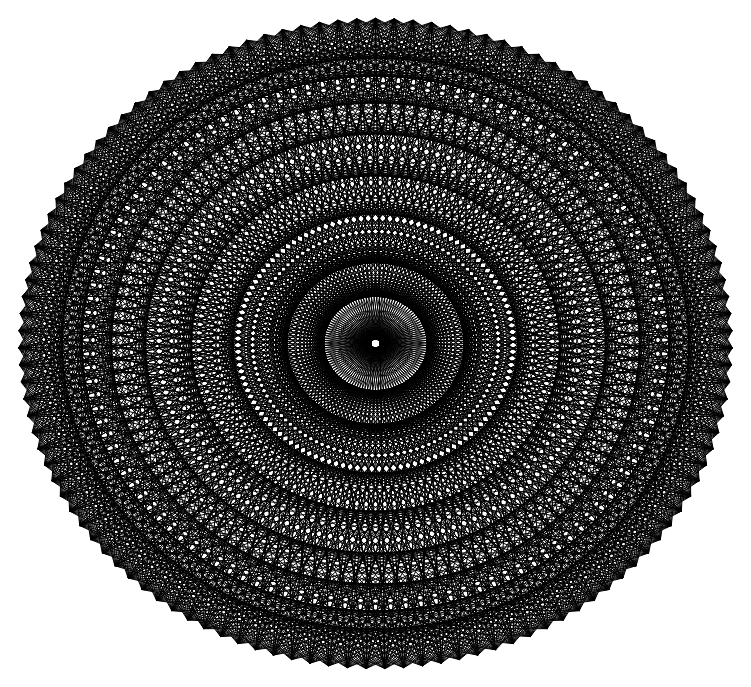
| Category | Series 0 |
|---|---|
| 0.0 | 1 |
| 0.026396871769836513 | -1 |
| -0.3115266979333915 | 0.95 |
| 0.7300520325410703 | -0.683 |
| -0.9978228006780053 | -0.066 |
| 0.40994978912605357 | 0.912 |
| 0.8287093708368187 | -0.56 |
| -0.4808280279743593 | -0.877 |
| -0.9894770367246195 | 0.145 |
| -0.40994978912605373 | 0.912 |
| 0.43388373911755823 | -0.901 |
| -0.6736956436465571 | 0.739 |
| 0.9460425935861947 | -0.324 |
| -0.8830852662071508 | -0.469 |
| 0.0 | 1 |
| 0.9853128822394974 | -0.171 |
| -0.07911704249342456 | -0.997 |
| -0.961825643172819 | -0.274 |
| -0.7478370394583645 | 0.664 |
| 0.7651008665813082 | -0.644 |
| -0.9174397974871565 | 0.398 |
| 0.9957341762950345 | 0.092 |
| -0.6131156327275369 | -0.79 |
| -0.40994978912605373 | 0.912 |
| 0.9687143340637886 | 0.248 |
| 0.33650143872273913 | -0.942 |
| -0.765100866581308 | -0.644 |
| -0.954266640349623 | 0.299 |
| 0.9618256431728192 | -0.274 |
| -0.9999128816724107 | -0.013 |
| 0.8703918045762196 | 0.492 |
| -0.23537019294084238 | -0.972 |
| -0.7478370394583645 | 0.664 |
| 0.7818314824680298 | 0.623 |
| 0.6929684125462466 | -0.721 |
| -0.4338837391175584 | -0.901 |
| -0.9929516085716733 | -0.119 |
| 0.9894770367246195 | 0.145 |
| -0.9066174626478123 | -0.422 |
| 0.5920486389876383 | 0.806 |
| 0.18374951781657037 | -0.983 |
| -0.954266640349623 | 0.299 |
| 0.45751530847532307 | 0.889 |
| 0.9276227536119478 | -0.374 |
| -0.026396871769835826 | -1 |
| -0.8570917527421047 | -0.515 |
| 0.8431943797272186 | 0.538 |
| -0.6539533652969677 | -0.757 |
| 0.20963290366854653 | 0.978 |
| 0.570569036923155 | -0.821 |
| -0.9929516085716733 | -0.119 |
| 0.05277534713046237 | 0.999 |
| 0.9992160261242876 | 0.04 |
| 0.38573013845977966 | -0.923 |
| -0.5705690369231552 | -0.821 |
| 0.5486917960180737 | 0.836 |
| -0.28633484912211227 | -0.958 |
| -0.2096329036685463 | 0.978 |
| 0.8570917527421046 | -0.515 |
| -0.8570917527421047 | -0.515 |
| -0.36124166618715303 | 0.932 |
| 0.8951632913550623 | 0.446 |
| 0.7300520325410703 | -0.683 |
| -0.18374951781657056 | -0.983 |
| 0.15773807393743752 | 0.987 |
| 0.13161669982939386 | -0.991 |
| -0.5920486389876387 | 0.806 |
| 0.9929516085716734 | -0.119 |
| -0.5705690369231552 | -0.821 |
| -0.711758240489971 | 0.702 |
| 0.6337553362123162 | 0.774 |
| 0.9460425935861947 | -0.324 |
| 0.23537019294084263 | -0.972 |
| -0.26094344889801746 | 0.965 |
| 0.5264321628773561 | -0.85 |
| -0.8703918045762195 | 0.492 |
| 0.954266640349623 | 0.299 |
| -0.18374951781657056 | -0.983 |
| -0.9371592343544655 | 0.349 |
| 0.26094344889801674 | 0.965 |
| 0.9957341762950345 | 0.092 |
| 0.6131156327275371 | -0.79 |
| -0.6337553362123161 | 0.774 |
| 0.8287093708368187 | -0.56 |
| -0.9957341762950346 | 0.092 |
| 0.7478370394583644 | 0.664 |
| 0.23537019294084263 | -0.972 |
| -0.9978228006780053 | -0.066 |
| -0.1577380739374372 | 0.987 |
| 0.8703918045762196 | 0.492 |
| 0.8830852662071507 | -0.469 |
| -0.8951632913550626 | 0.446 |
| 0.9853128822394974 | -0.171 |
| -0.9460425935861949 | -0.324 |
| 0.40994978912605357 | 0.912 |
| 0.6131156327275371 | -0.79 |
| -0.8830852662071508 | -0.469 |
| -0.5486917960180743 | 0.836 |
| 0.5920486389876383 | 0.806 |
| 0.9978228006780053 | -0.066 |
| -0.9992160261242876 | 0.04 |
| 0.9687143340637886 | 0.248 |
| -0.7300520325410699 | -0.683 |
| 0.0 | 1 |
| 0.8830852662071507 | -0.469 |
| -0.6131156327275369 | -0.79 |
| -0.8431943797272183 | 0.538 |
| 0.20963290366854653 | 0.978 |
| 0.9371592343544655 | 0.349 |
| -0.9276227536119476 | -0.374 |
| 0.7818314824680298 | 0.623 |
| -0.3857301384597794 | -0.923 |
| -0.40994978912605373 | 0.912 |
| 0.9978228006780053 | -0.066 |
| -0.23537019294084238 | -0.972 |
| -0.9894770367246195 | 0.145 |
| -0.2096329036685463 | 0.978 |
| 0.7117582404899709 | 0.702 |
| -0.6929684125462469 | -0.721 |
| 0.45751530847532307 | 0.889 |
| 0.026396871769836513 | -1 |
| -0.7478370394583645 | 0.664 |
| 0.9371592343544655 | 0.349 |
| 0.18374951781657037 | -0.983 |
| -0.961825643172819 | -0.274 |
| -0.5920486389876387 | 0.806 |
| 0.3612416661871529 | 0.932 |
| -0.33650143872273935 | -0.942 |
| 0.05277534713046237 | 0.999 |
| 0.43388373911755823 | -0.901 |
| -0.954266640349623 | 0.299 |
| 0.7117582404899709 | 0.702 |
| 0.570569036923155 | -0.821 |
| -0.765100866581308 | -0.644 |
| -0.8703918045762195 | 0.492 |
| -0.05277534713046272 | 0.999 |
| 0.07911704249342437 | -0.997 |
| -0.36124166618715303 | 0.932 |
| 0.7651008665813082 | -0.644 |
| -0.9929516085716733 | -0.119 |
| 0.3612416661871529 | 0.932 |
| 0.8570917527421046 | -0.515 |
| -0.4338837391175584 | -0.901 |
| -0.9957341762950346 | 0.092 |
| -0.45751530847532335 | 0.889 |
| 0.48082802797435914 | -0.877 |
| -0.711758240489971 | 0.702 |
| 0.9618256431728192 | -0.274 |
| -0.8570917527421047 | -0.515 |
| -0.05277534713046272 | 0.999 |
| 0.9929516085716734 | -0.119 |
| -0.026396871769835826 | -1 |
| -0.9460425935861949 | -0.324 |
| -0.7818314824680299 | 0.623 |
| 0.7980172272802396 | -0.603 |
| -0.9371592343544655 | 0.349 |
| 0.9894770367246195 | 0.145 |
| -0.5705690369231552 | -0.821 |
| -0.45751530847532335 | 0.889 |
| 0.954266640349623 | 0.299 |
| 0.38573013845977966 | -0.923 |
| -0.7300520325410699 | -0.683 |
| -0.9687143340637886 | 0.248 |
| 0.9749279121818236 | -0.223 |
| -0.9978228006780053 | -0.066 |
| 0.8431943797272186 | 0.538 |
| -0.18374951781657056 | -0.983 |
| -0.7818314824680299 | 0.623 |
| 0.7478370394583644 | 0.664 |
| 0.7300520325410703 | -0.683 |
| -0.3857301384597794 | -0.923 |
| -0.9853128822394974 | -0.171 |
| 0.9804620471832867 | 0.197 |
| -0.8830852662071508 | -0.469 |
| 0.5486917960180737 | 0.836 |
| 0.23537019294084263 | -0.972 |
| -0.9687143340637886 | 0.248 |
| 0.40994978912605357 | 0.912 |
| 0.9460425935861947 | -0.324 |
| 0.026396871769836513 | -1 |
| -0.8287093708368186 | -0.56 |
| 0.8136468209091602 | 0.581 |
| -0.6131156327275369 | -0.79 |
| 0.15773807393743752 | 0.987 |
| 0.6131156327275371 | -0.79 |
| -0.9853128822394974 | -0.171 |
| 0.0 | 1 |
| 0.9957341762950345 | 0.092 |
| 0.43388373911755823 | -0.901 |
| -0.5264321628773555 | -0.85 |
| 0.5038056506013295 | 0.864 |
| -0.23537019294084238 | -0.972 |
| -0.26094344889801746 | 0.965 |
| 0.8830852662071507 | -0.469 |
| -0.8287093708368186 | -0.56 |
| -0.40994978912605373 | 0.912 |
| 0.8703918045762196 | 0.492 |
| 0.7651008665813082 | -0.644 |
| -0.13161669982939317 | -0.991 |
| 0.10540359990284776 | 0.994 |
| 0.18374951781657037 | -0.983 |
| -0.6337553362123161 | 0.774 |
| 0.9978228006780053 | -0.066 |
| -0.5264321628773555 | -0.85 |
| -0.7478370394583645 | 0.664 |
| 0.5920486389876383 | 0.806 |
| 0.9618256431728192 | -0.274 |
| 0.2863348491221129 | -0.958 |
| -0.3115266979333915 | 0.95 |
| 0.570569036923155 | -0.821 |
| -0.8951632913550626 | 0.446 |
| 0.9371592343544655 | 0.349 |
| -0.13161669982939317 | -0.991 |
| -0.954266640349623 | 0.299 |
| 0.20963290366854653 | 0.978 |
| 0.9894770367246195 | 0.145 |
| 0.6539533652969682 | -0.757 |
| -0.6736956436465571 | 0.739 |
| 0.8570917527421046 | -0.515 |
| -0.9992160261242876 | 0.04 |
| 0.7117582404899709 | 0.702 |
| 0.2863348491221129 | -0.958 |
| -0.9929516085716733 | -0.119 |
| -0.2096329036685463 | 0.978 |
| 0.8431943797272186 | 0.538 |
| 0.9066174626478126 | -0.422 |
| -0.9174397974871565 | 0.398 |
| 0.9929516085716734 | -0.119 |
| -0.9276227536119476 | -0.374 |
| 0.3612416661871529 | 0.932 |
| 0.6539533652969682 | -0.757 |
| -0.8570917527421047 | -0.515 |
| -0.5920486389876387 | 0.806 |
| 0.5486917960180737 | 0.836 |
| 0.9999128816724107 | -0.013 |
| -0.9999128816724107 | -0.013 |
| 0.954266640349623 | 0.299 |
| -0.6929684125462469 | -0.721 |
| -0.05277534713046272 | 0.999 |
| 0.9066174626478126 | -0.422 |
| -0.5705690369231552 | -0.821 |
| -0.8703918045762195 | 0.492 |
| 0.15773807393743752 | 0.987 |
| 0.9174397974871562 | 0.398 |
| -0.9066174626478123 | -0.422 |
| 0.7478370394583644 | 0.664 |
| -0.33650143872273935 | -0.942 |
| -0.45751530847532335 | 0.889 |
| 0.9999128816724107 | -0.013 |
| -0.18374951781657056 | -0.983 |
| -0.9957341762950346 | 0.092 |
| -0.26094344889801746 | 0.965 |
| 0.6736956436465572 | 0.739 |
| -0.6539533652969677 | -0.757 |
| 0.40994978912605357 | 0.912 |
| 0.07911704249342437 | -0.997 |
| -0.7818314824680299 | 0.623 |
| 0.9174397974871562 | 0.398 |
| 0.23537019294084263 | -0.972 |
| -0.9460425935861949 | -0.324 |
| -0.6337553362123161 | 0.774 |
| 0.31152669793339155 | 0.95 |
| -0.28633484912211227 | -0.958 |
| 0.0 | 1 |
| 0.48082802797435914 | -0.877 |
| -0.9687143340637886 | 0.248 |
| 0.6736956436465572 | 0.739 |
| 0.6131156327275371 | -0.79 |
| -0.7300520325410699 | -0.683 |
| -0.8951632913550626 | 0.446 |
| -0.1054035999028482 | 0.994 |
| 0.13161669982939386 | -0.991 |
| -0.40994978912605373 | 0.912 |
| 0.7980172272802396 | -0.603 |
| -0.9853128822394974 | -0.171 |
| 0.31152669793339155 | 0.95 |
| 0.8830852662071507 | -0.469 |
| -0.3857301384597794 | -0.923 |
| -0.9992160261242876 | 0.04 |
| -0.5038056506013299 | 0.864 |
| 0.5264321628773561 | -0.85 |
| -0.7478370394583645 | 0.664 |
| 0.9749279121818236 | -0.223 |
| -0.8287093708368186 | -0.56 |
| -0.1054035999028482 | 0.994 |
| 0.9978228006780053 | -0.066 |
| 0.026396871769836513 | -1 |
| -0.9276227536119476 | -0.374 |
| -0.8136468209091604 | 0.581 |
| 0.8287093708368187 | -0.56 |
| -0.954266640349623 | 0.299 |
| 0.9804620471832867 | 0.197 |
| -0.5264321628773555 | -0.85 |
| -0.5038056506013299 | 0.864 |
| 0.9371592343544655 | 0.349 |
| 0.43388373911755823 | -0.901 |
| -0.6929684125462469 | -0.721 |
| -0.9804620471832867 | 0.197 |
| 0.9853128822394974 | -0.171 |
| -0.9929516085716733 | -0.119 |
| 0.8136468209091602 | 0.581 |
| -0.13161669982939317 | -0.991 |
| -0.8136468209091604 | 0.581 |
| 0.7117582404899709 | 0.702 |
| 0.7651008665813082 | -0.644 |
| -0.33650143872273935 | -0.942 |
| -0.9749279121818236 | -0.223 |
| 0.9687143340637886 | 0.248 |
| -0.8570917527421047 | -0.515 |
| 0.5038056506013295 | 0.864 |
| 0.2863348491221129 | -0.958 |
| -0.9804620471832867 | 0.197 |
| 0.3612416661871529 | 0.932 |
| 0.9618256431728192 | -0.274 |
| 0.07911704249342437 | -0.997 |
| -0.7980172272802395 | -0.603 |
| 0.7818314824680298 | 0.623 |
| -0.5705690369231552 | -0.821 |
| 0.10540359990284776 | 0.994 |
| 0.6539533652969682 | -0.757 |
| -0.9749279121818236 | -0.223 |
| -0.05277534713046272 | 0.999 |
| 0.9894770367246195 | 0.145 |
| 0.48082802797435914 | -0.877 |
| -0.4808280279743593 | -0.877 |
| 0.45751530847532307 | 0.889 |
| -0.18374951781657056 | -0.983 |
| -0.3115266979333915 | 0.95 |
| 0.9066174626478126 | -0.422 |
| -0.7980172272802395 | -0.603 |
| -0.45751530847532335 | 0.889 |
| 0.8431943797272186 | 0.538 |
| 0.7980172272802396 | -0.603 |
| -0.07911704249342456 | -0.997 |
| 0.05277534713046237 | 0.999 |
| 0.23537019294084263 | -0.972 |
| -0.6736956436465571 | 0.739 |
| 0.9999128816724107 | -0.013 |
| -0.4808280279743593 | -0.877 |
| -0.7818314824680299 | 0.623 |
| 0.5486917960180737 | 0.836 |
| 0.9749279121818236 | -0.223 |
| 0.33650143872273913 | -0.942 |
| -0.36124166618715303 | 0.932 |
| 0.6131156327275371 | -0.79 |
| -0.9174397974871565 | 0.398 |
| 0.9174397974871562 | 0.398 |
| -0.07911704249342456 | -0.997 |
| -0.9687143340637886 | 0.248 |
| 0.15773807393743752 | 0.987 |
| 0.9804620471832867 | 0.197 |
| 0.6929684125462466 | -0.721 |
| -0.711758240489971 | 0.702 |
| 0.8830852662071507 | -0.469 |
| -0.9999128816724107 | -0.013 |
| 0.6736956436465572 | 0.739 |
| 0.33650143872273913 | -0.942 |
| -0.9853128822394974 | -0.171 |
| -0.26094344889801746 | 0.965 |
| 0.8136468209091602 | 0.581 |
| 0.9276227536119478 | -0.374 |
| -0.9371592343544655 | 0.349 |
| 0.9978228006780053 | -0.066 |
| -0.9066174626478123 | -0.422 |
| 0.31152669793339155 | 0.95 |
| 0.6929684125462466 | -0.721 |
| -0.8287093708368186 | -0.56 |
| -0.6337553362123161 | 0.774 |
| 0.5038056506013295 | 0.864 |
| 0.9992160261242876 | 0.04 |
| -0.9978228006780053 | -0.066 |
| 0.9371592343544655 | 0.349 |
| -0.6539533652969677 | -0.757 |
| -0.1054035999028482 | 0.994 |
| 0.9276227536119478 | -0.374 |
| -0.5264321628773555 | -0.85 |
| -0.8951632913550626 | 0.446 |
| 0.10540359990284776 | 0.994 |
| 0.8951632913550623 | 0.446 |
| -0.8830852662071508 | -0.469 |
| 0.7117582404899709 | 0.702 |
| -0.28633484912211227 | -0.958 |
| -0.5038056506013299 | 0.864 |
| 0.9992160261242876 | 0.04 |
| -0.13161669982939317 | -0.991 |
| -0.9992160261242876 | 0.04 |
| -0.3115266979333915 | 0.95 |
| 0.6337553362123162 | 0.774 |
| -0.6131156327275369 | -0.79 |
| 0.3612416661871529 | 0.932 |
| 0.13161669982939386 | -0.991 |
| -0.8136468209091604 | 0.581 |
| 0.8951632913550623 | 0.446 |
| 0.2863348491221129 | -0.958 |
| -0.9276227536119476 | -0.374 |
| -0.6736956436465571 | 0.739 |
| 0.26094344889801674 | 0.965 |
| -0.23537019294084238 | -0.972 |
| -0.05277534713046272 | 0.999 |
| 0.5264321628773561 | -0.85 |
| -0.9804620471832867 | 0.197 |
| 0.6337553362123162 | 0.774 |
| 0.6539533652969682 | -0.757 |
| -0.6929684125462469 | -0.721 |
| -0.9174397974871565 | 0.398 |
| -0.1577380739374372 | 0.987 |
| 0.18374951781657037 | -0.983 |
| -0.45751530847532335 | 0.889 |
| 0.8287093708368187 | -0.56 |
| -0.9749279121818236 | -0.223 |
| 0.26094344889801674 | 0.965 |
| 0.9066174626478126 | -0.422 |
| -0.33650143872273935 | -0.942 |
| -0.9999128816724107 | -0.013 |
| -0.5486917960180743 | 0.836 |
| 0.570569036923155 | -0.821 |
| -0.7818314824680299 | 0.623 |
| 0.9853128822394974 | -0.171 |
| -0.7980172272802395 | -0.603 |
| -0.1577380739374372 | 0.987 |
| 0.9999128816724107 | -0.013 |
| 0.07911704249342437 | -0.997 |
| -0.9066174626478123 | -0.422 |
| -0.8431943797272183 | 0.538 |
| 0.8570917527421046 | -0.515 |
| -0.9687143340637886 | 0.248 |
| 0.9687143340637886 | 0.248 |
| -0.4808280279743593 | -0.877 |
| -0.5486917960180743 | 0.836 |
| 0.9174397974871562 | 0.398 |
| 0.48082802797435914 | -0.877 |
| -0.6539533652969677 | -0.757 |
| -0.9894770367246195 | 0.145 |
| 0.9929516085716734 | -0.119 |
| -0.9853128822394974 | -0.171 |
| 0.7818314824680298 | 0.623 |
| -0.07911704249342456 | -0.997 |
| -0.8431943797272183 | 0.538 |
| 0.6736956436465572 | 0.739 |
| 0.7980172272802396 | -0.603 |
| -0.28633484912211227 | -0.958 |
| -0.961825643172819 | -0.274 |
| 0.954266640349623 | 0.299 |
| -0.8287093708368186 | -0.56 |
| 0.45751530847532307 | 0.889 |
| 0.33650143872273913 | -0.942 |
| -0.9894770367246195 | 0.145 |
| 0.31152669793339155 | 0.95 |
| 0.9749279121818236 | -0.223 |
| 0.13161669982939386 | -0.991 |
| -0.765100866581308 | -0.644 |
| 0.7478370394583644 | 0.664 |
| -0.5264321628773555 | -0.85 |
| 0.05277534713046237 | 0.999 |
| 0.6929684125462466 | -0.721 |
| -0.961825643172819 | -0.274 |
| -0.1054035999028482 | 0.994 |
| 0.9804620471832867 | 0.197 |
| 0.5264321628773561 | -0.85 |
| -0.4338837391175584 | -0.901 |
| 0.40994978912605357 | 0.912 |
| -0.13161669982939317 | -0.991 |
| -0.36124166618715303 | 0.932 |
| 0.9276227536119478 | -0.374 |
| -0.765100866581308 | -0.644 |
| -0.5038056506013299 | 0.864 |
| 0.8136468209091602 | 0.581 |
| 0.8287093708368187 | -0.56 |
| -0.026396871769835826 | -1 |
| 0.0 | 1 |
| 0.2863348491221129 | -0.958 |
| -0.711758240489971 | 0.702 |
| 0.9992160261242876 | 0.04 |
| -0.4338837391175584 | -0.901 |
| -0.8136468209091604 | 0.581 |
| 0.5038056506013295 | 0.864 |
| 0.9853128822394974 | -0.171 |
| 0.38573013845977966 | -0.923 |
| -0.40994978912605373 | 0.912 |
| 0.6539533652969682 | -0.757 |
| -0.9371592343544655 | 0.349 |
| 0.8951632913550623 | 0.446 |
| -0.026396871769835826 | -1 |
| -0.9804620471832867 | 0.197 |
| 0.10540359990284776 | 0.994 |
| 0.9687143340637886 | 0.248 |
| 0.7300520325410703 | -0.683 |
| -0.7478370394583645 | 0.664 |
| 0.9066174626478126 | -0.422 |
| -0.9978228006780053 | -0.066 |
| 0.6337553362123162 | 0.774 |
| 0.38573013845977966 | -0.923 |
| -0.9749279121818236 | -0.223 |
| -0.3115266979333915 | 0.95 |
| 0.7818314824680298 | 0.623 |
| 0.9460425935861947 | -0.324 |
| -0.954266640349623 | 0.299 |
| 0.9999128816724107 | -0.013 |
| -0.8830852662071508 | -0.469 |
| 0.26094344889801674 | 0.965 |
| 0.7300520325410703 | -0.683 |
| -0.7980172272802395 | -0.603 |
| -0.6736956436465571 | 0.739 |
| 0.45751530847532307 | 0.889 |
| 0.9957341762950345 | 0.092 |
| -0.9929516085716733 | -0.119 |
| 0.9174397974871562 | 0.398 |
| -0.6131156327275369 | -0.79 |
| -0.1577380739374372 | 0.987 |
| 0.9460425935861947 | -0.324 |
| -0.4808280279743593 | -0.877 |
| -0.9174397974871565 | 0.398 |
| 0.05277534713046237 | 0.999 |
| 0.8703918045762196 | 0.492 |
| -0.8570917527421047 | -0.515 |
| 0.6736956436465572 | 0.739 |
| -0.23537019294084238 | -0.972 |
| -0.5486917960180743 | 0.836 |
| 0.9957341762950345 | 0.092 |
| -0.07911704249342456 | -0.997 |
| -0.9999128816724107 | -0.013 |
| -0.36124166618715303 | 0.932 |
| 0.5920486389876383 | 0.806 |
| -0.5705690369231552 | -0.821 |
| 0.31152669793339155 | 0.95 |
| 0.18374951781657037 | -0.983 |
| -0.8431943797272183 | 0.538 |
| 0.8703918045762196 | 0.492 |
| 0.33650143872273913 | -0.942 |
| -0.9066174626478123 | -0.422 |
| -0.711758240489971 | 0.702 |
| 0.20963290366854653 | 0.978 |
| -0.18374951781657056 | -0.983 |
| -0.1054035999028482 | 0.994 |
| 0.570569036923155 | -0.821 |
| -0.9894770367246195 | 0.145 |
| 0.5920486389876383 | 0.806 |
| 0.6929684125462466 | -0.721 |
| -0.6539533652969677 | -0.757 |
| -0.9371592343544655 | 0.349 |
| -0.2096329036685463 | 0.978 |
| 0.23537019294084263 | -0.972 |
| -0.5038056506013299 | 0.864 |
| 0.8570917527421046 | -0.515 |
| -0.961825643172819 | -0.274 |
| 0.20963290366854653 | 0.978 |
| 0.9276227536119478 | -0.374 |
| -0.28633484912211227 | -0.958 |
| -0.9978228006780053 | -0.066 |
| -0.5920486389876387 | 0.806 |
| 0.6131156327275371 | -0.79 |
| -0.8136468209091604 | 0.581 |
| 0.9929516085716734 | -0.119 |
| -0.765100866581308 | -0.644 |
| -0.2096329036685463 | 0.978 |
| 0.9992160261242876 | 0.04 |
| 0.13161669982939386 | -0.991 |
| -0.8830852662071508 | -0.469 |
| -0.8703918045762195 | 0.492 |
| 0.8830852662071507 | -0.469 |
| -0.9804620471832867 | 0.197 |
| 0.954266640349623 | 0.299 |
| -0.4338837391175584 | -0.901 |
| -0.5920486389876387 | 0.806 |
| 0.8951632913550623 | 0.446 |
| 0.5264321628773561 | -0.85 |
| -0.6131156327275369 | -0.79 |
| -0.9957341762950346 | 0.092 |
| 0.9978228006780053 | -0.066 |
| -0.9749279121818236 | -0.223 |
| 0.7478370394583644 | 0.664 |
| -0.026396871769835826 | -1 |
| -0.8703918045762195 | 0.492 |
| 0.6337553362123162 | 0.774 |
| 0.8287093708368187 | -0.56 |
| -0.23537019294084238 | -0.972 |
| -0.9460425935861949 | -0.324 |
| 0.9371592343544655 | 0.349 |
| -0.7980172272802395 | -0.603 |
| 0.40994978912605357 | 0.912 |
| 0.38573013845977966 | -0.923 |
| -0.9957341762950346 | 0.092 |
| 0.26094344889801674 | 0.965 |
| 0.9853128822394974 | -0.171 |
| 0.18374951781657037 | -0.983 |
| -0.7300520325410699 | -0.683 |
| 0.7117582404899709 | 0.702 |
| -0.4808280279743593 | -0.877 |
| 0.0 | 1 |
| 0.7300520325410703 | -0.683 |
| -0.9460425935861949 | -0.324 |
| -0.1577380739374372 | 0.987 |
| 0.9687143340637886 | 0.248 |
| 0.570569036923155 | -0.821 |
| -0.3857301384597794 | -0.923 |
| 0.3612416661871529 | 0.932 |
| -0.07911704249342456 | -0.997 |
| -0.40994978912605373 | 0.912 |
| 0.9460425935861947 | -0.324 |
| -0.7300520325410699 | -0.683 |
| -0.5486917960180743 | 0.836 |
| 0.7818314824680298 | 0.623 |
| 0.8570917527421046 | -0.515 |
| 0.026396871769836513 | -1 |
| -0.05277534713046272 | 0.999 |
| 0.33650143872273913 | -0.942 |
| -0.7478370394583645 | 0.664 |
| 0.9957341762950345 | 0.092 |
| -0.3857301384597794 | -0.923 |
| -0.8431943797272183 | 0.538 |
| 0.45751530847532307 | 0.889 |
| 0.9929516085716734 | -0.119 |
| 0.43388373911755823 | -0.901 |
| -0.45751530847532335 | 0.889 |
| 0.6929684125462466 | -0.721 |
| -0.954266640349623 | 0.299 |
| 0.8703918045762196 | 0.492 |
| 0.026396871769836513 | -1 |
| -0.9894770367246195 | 0.145 |
| 0.05277534713046237 | 0.999 |
| 0.954266640349623 | 0.299 |
| 0.7651008665813082 | -0.644 |
| -0.7818314824680299 | 0.623 |
| 0.9276227536119478 | -0.374 |
| -0.9929516085716733 | -0.119 |
| 0.5920486389876383 | 0.806 |
| 0.43388373911755823 | -0.901 |
| -0.961825643172819 | -0.274 |
| -0.36124166618715303 | 0.932 |
| 0.7478370394583644 | 0.664 |
| 0.9618256431728192 | -0.274 |
| -0.9687143340637886 | 0.248 |
| 0.9992160261242876 | 0.04 |
| -0.8570917527421047 | -0.515 |
| 0.20963290366854653 | 0.978 |
| 0.7651008665813082 | -0.644 |
| -0.765100866581308 | -0.644 |
| -0.711758240489971 | 0.702 |
| 0.40994978912605357 | 0.912 |
| 0.9894770367246195 | 0.145 |
| -0.9853128822394974 | -0.171 |
| 0.8951632913550623 | 0.446 |
| -0.5705690369231552 | -0.821 |
| -0.2096329036685463 | 0.978 |
| 0.9618256431728192 | -0.274 |
| -0.4338837391175584 | -0.901 |
| -0.9371592343544655 | 0.349 |
| 0.0 | 1 |
| 0.8431943797272186 | 0.538 |
| -0.8287093708368186 | -0.56 |
| 0.6337553362123162 | 0.774 |
| -0.18374951781657056 | -0.983 |
| -0.5920486389876387 | 0.806 |
| 0.9894770367246195 | 0.145 |
| -0.026396871769835826 | -1 |
| -0.9978228006780053 | -0.066 |
| -0.40994978912605373 | 0.912 |
| 0.5486917960180737 | 0.836 |
| -0.5264321628773555 | -0.85 |
| 0.26094344889801674 | 0.965 |
| 0.23537019294084263 | -0.972 |
| -0.8703918045762195 | 0.492 |
| 0.8431943797272186 | 0.538 |
| 0.38573013845977966 | -0.923 |
| -0.8830852662071508 | -0.469 |
| -0.7478370394583645 | 0.664 |
| 0.15773807393743752 | 0.987 |
| -0.13161669982939317 | -0.991 |
| -0.1577380739374372 | 0.987 |
| 0.6131156327275371 | -0.79 |
| -0.9957341762950346 | 0.092 |
| 0.5486917960180737 | 0.836 |
| 0.7300520325410703 | -0.683 |
| -0.6131156327275369 | -0.79 |
| -0.954266640349623 | 0.299 |
| -0.26094344889801746 | 0.965 |
| 0.2863348491221129 | -0.958 |
| -0.5486917960180743 | 0.836 |
| 0.8830852662071507 | -0.469 |
| -0.9460425935861949 | -0.324 |
| 0.15773807393743752 | 0.987 |
| 0.9460425935861947 | -0.324 |
| -0.23537019294084238 | -0.972 |
| -0.9929516085716733 | -0.119 |
| -0.6337553362123161 | 0.774 |
| 0.6539533652969682 | -0.757 |
| -0.8431943797272183 | 0.538 |
| 0.9978228006780053 | -0.066 |
| -0.7300520325410699 | -0.683 |
| -0.26094344889801746 | 0.965 |
| 0.9957341762950345 | 0.092 |
| 0.18374951781657037 | -0.983 |
| -0.8570917527421047 | -0.515 |
| -0.8951632913550626 | 0.446 |
| 0.9066174626478126 | -0.422 |
| -0.9894770367246195 | 0.145 |
| 0.9371592343544655 | 0.349 |
| -0.3857301384597794 | -0.923 |
| -0.6337553362123161 | 0.774 |
| 0.8703918045762196 | 0.492 |
| 0.570569036923155 | -0.821 |
| -0.5705690369231552 | -0.821 |
| -0.9992160261242876 | 0.04 |
| 0.9999128816724107 | -0.013 |
| -0.961825643172819 | -0.274 |
| 0.7117582404899709 | 0.702 |
| 0.026396871769836513 | -1 |
| -0.8951632913550626 | 0.446 |
| 0.5920486389876383 | 0.806 |
| 0.8570917527421046 | -0.515 |
| -0.18374951781657056 | -0.983 |
| -0.9276227536119476 | -0.374 |
| 0.9174397974871562 | 0.398 |
| -0.765100866581308 | -0.644 |
| 0.3612416661871529 | 0.932 |
| 0.43388373911755823 | -0.901 |
| -0.9992160261242876 | 0.04 |
| 0.20963290366854653 | 0.978 |
| 0.9929516085716734 | -0.119 |
| 0.23537019294084263 | -0.972 |
| -0.6929684125462469 | -0.721 |
| 0.6736956436465572 | 0.739 |
| -0.4338837391175584 | -0.901 |
| -0.05277534713046272 | 0.999 |
| 0.7651008665813082 | -0.644 |
| -0.9276227536119476 | -0.374 |
| -0.2096329036685463 | 0.978 |
| 0.954266640349623 | 0.299 |
| 0.6131156327275371 | -0.79 |
| -0.33650143872273935 | -0.942 |
| 0.31152669793339155 | 0.95 |
| -0.026396871769835826 | -1 |
| -0.45751530847532335 | 0.889 |
| 0.9618256431728192 | -0.274 |
| -0.6929684125462469 | -0.721 |
| -0.5920486389876387 | 0.806 |
| 0.7478370394583644 | 0.664 |
| 0.8830852662071507 | -0.469 |
| 0.07911704249342437 | -0.997 |
| -0.1054035999028482 | 0.994 |
| 0.38573013845977966 | -0.923 |
| -0.7818314824680299 | 0.623 |
| 0.9894770367246195 | 0.145 |
| -0.33650143872273935 | -0.942 |
| -0.8703918045762195 | 0.492 |
| 0.40994978912605357 | 0.912 |
| 0.9978228006780053 | -0.066 |
| 0.48082802797435914 | -0.877 |
| -0.5038056506013299 | 0.864 |
| 0.7300520325410703 | -0.683 |
| -0.9687143340637886 | 0.248 |
| 0.8431943797272186 | 0.538 |
| 0.07911704249342437 | -0.997 |
| -0.9957341762950346 | 0.092 |
| 0.0 | 1 |
| 0.9371592343544655 | 0.349 |
| 0.7980172272802396 | -0.603 |
| -0.8136468209091604 | 0.581 |
| 0.9460425935861947 | -0.324 |
| -0.9853128822394974 | -0.171 |
| 0.5486917960180737 | 0.836 |
| 0.48082802797435914 | -0.877 |
| -0.9460425935861949 | -0.324 |
| -0.40994978912605373 | 0.912 |
| 0.7117582404899709 | 0.702 |
| 0.9749279121818236 | -0.223 |
| -0.9804620471832867 | 0.197 |
| 0.9957341762950345 | 0.092 |
| -0.8287093708368186 | -0.56 |
| 0.15773807393743752 | 0.987 |
| 0.7980172272802396 | -0.603 |
| -0.7300520325410699 | -0.683 |
| -0.7478370394583645 | 0.664 |
| 0.3612416661871529 | 0.932 |
| 0.9804620471832867 | 0.197 |
| -0.9749279121818236 | -0.223 |
| 0.8703918045762196 | 0.492 |
| -0.5264321628773555 | -0.85 |
| -0.26094344889801746 | 0.965 |
| 0.9749279121818236 | -0.223 |
| -0.3857301384597794 | -0.923 |
| -0.954266640349623 | 0.299 |
| -0.05277534713046272 | 0.999 |
| 0.8136468209091602 | 0.581 |
| -0.7980172272802395 | -0.603 |
| 0.5920486389876383 | 0.806 |
| -0.13161669982939317 | -0.991 |
| -0.6337553362123161 | 0.774 |
| 0.9804620471832867 | 0.197 |
| 0.026396871769836513 | -1 |
| -0.9929516085716733 | -0.119 |
| -0.45751530847532335 | 0.889 |
| 0.5038056506013295 | 0.864 |
| -0.4808280279743593 | -0.877 |
| 0.20963290366854653 | 0.978 |
| 0.2863348491221129 | -0.958 |
| -0.8951632913550626 | 0.446 |
| 0.8136468209091602 | 0.581 |
| 0.43388373911755823 | -0.901 |
| -0.8570917527421047 | -0.515 |
| -0.7818314824680299 | 0.623 |
| 0.10540359990284776 | 0.994 |
| -0.07911704249342456 | -0.997 |
| -0.2096329036685463 | 0.978 |
| 0.6539533652969682 | -0.757 |
| -0.9992160261242876 | 0.04 |
| 0.5038056506013295 | 0.864 |
| 0.7651008665813082 | -0.644 |
| -0.5705690369231552 | -0.821 |
| -0.9687143340637886 | 0.248 |
| -0.3115266979333915 | 0.95 |
| 0.33650143872273913 | -0.942 |
| -0.5920486389876387 | 0.806 |
| 0.9066174626478126 | -0.422 |
| -0.9276227536119476 | -0.374 |
| 0.10540359990284776 | 0.994 |
| 0.9618256431728192 | -0.274 |
| -0.18374951781657056 | -0.983 |
| -0.9853128822394974 | -0.171 |
| -0.6736956436465571 | 0.739 |
| 0.6929684125462466 | -0.721 |
| -0.8703918045762195 | 0.492 |
| 0.9999128816724107 | -0.013 |
| -0.6929684125462469 | -0.721 |
| -0.3115266979333915 | 0.95 |
| 0.9894770367246195 | 0.145 |
| 0.23537019294084263 | -0.972 |
| -0.8287093708368186 | -0.56 |
| -0.9174397974871565 | 0.398 |
| 0.9276227536119478 | -0.374 |
| -0.9957341762950346 | 0.092 |
| 0.9174397974871562 | 0.398 |
| -0.33650143872273935 | -0.942 |
| -0.6736956436465571 | 0.739 |
| 0.8431943797272186 | 0.538 |
| 0.6131156327275371 | -0.79 |
| -0.5264321628773555 | -0.85 |
| -0.9999128816724107 | -0.013 |
| 0.9992160261242876 | 0.04 |
| -0.9460425935861949 | -0.324 |
| 0.6736956436465572 | 0.739 |
| 0.07911704249342437 | -0.997 |
| -0.9174397974871565 | 0.398 |
| 0.5486917960180737 | 0.836 |
| 0.8830852662071507 | -0.469 |
| -0.13161669982939317 | -0.991 |
| -0.9066174626478123 | -0.422 |
| 0.8951632913550623 | 0.446 |
| -0.7300520325410699 | -0.683 |
| 0.31152669793339155 | 0.95 |
| 0.48082802797435914 | -0.877 |
| -0.9999128816724107 | -0.013 |
| 0.15773807393743752 | 0.987 |
| 0.9978228006780053 | -0.066 |
| 0.2863348491221129 | -0.958 |
| -0.6539533652969677 | -0.757 |
| 0.6337553362123162 | 0.774 |
| -0.3857301384597794 | -0.923 |
| -0.1054035999028482 | 0.994 |
| 0.7980172272802396 | -0.603 |
| -0.9066174626478123 | -0.422 |
| -0.26094344889801746 | 0.965 |
| 0.9371592343544655 | 0.349 |
| 0.6539533652969682 | -0.757 |
| -0.28633484912211227 | -0.958 |
| 0.26094344889801674 | 0.965 |
| 0.026396871769836513 | -1 |
| -0.5038056506013299 | 0.864 |
| 0.9749279121818236 | -0.223 |
| -0.6539533652969677 | -0.757 |
| -0.6337553362123161 | 0.774 |
| 0.7117582404899709 | 0.702 |
| 0.9066174626478126 | -0.422 |
| 0.13161669982939386 | -0.991 |
| -0.1577380739374372 | 0.987 |
| 0.43388373911755823 | -0.901 |
| -0.8136468209091604 | 0.581 |
| 0.9804620471832867 | 0.197 |
| -0.28633484912211227 | -0.958 |
| -0.8951632913550626 | 0.446 |
| 0.3612416661871529 | 0.932 |
| 0.9999128816724107 | -0.013 |
| 0.5264321628773561 | -0.85 |
| -0.5486917960180743 | 0.836 |
| 0.7651008665813082 | -0.644 |
| -0.9804620471832867 | 0.197 |
| 0.8136468209091602 | 0.581 |
| 0.13161669982939386 | -0.991 |
| -0.9992160261242876 | 0.04 |
| -0.05277534713046272 | 0.999 |
| 0.9174397974871562 | 0.398 |
| 0.8287093708368187 | -0.56 |
| -0.8431943797272183 | 0.538 |
| 0.9618256431728192 | -0.274 |
| -0.9749279121818236 | -0.223 |
| 0.5038056506013295 | 0.864 |
| 0.5264321628773561 | -0.85 |
| -0.9276227536119476 | -0.374 |
| -0.45751530847532335 | 0.889 |
| 0.6736956436465572 | 0.739 |
| 0.9853128822394974 | -0.171 |
| -0.9894770367246195 | 0.145 |
| 0.9894770367246195 | 0.145 |
| -0.7980172272802395 | -0.603 |
| 0.10540359990284776 | 0.994 |
| 0.8287093708368187 | -0.56 |
| -0.6929684125462469 | -0.721 |
| -0.7818314824680299 | 0.623 |
| 0.31152669793339155 | 0.95 |
| 0.9687143340637886 | 0.248 |
| -0.961825643172819 | -0.274 |
| 0.8431943797272186 | 0.538 |
| -0.4808280279743593 | -0.877 |
| -0.3115266979333915 | 0.95 |
| 0.9853128822394974 | -0.171 |
| -0.33650143872273935 | -0.942 |
| -0.9687143340637886 | 0.248 |
| -0.1054035999028482 | 0.994 |
| 0.7818314824680298 | 0.623 |
| -0.765100866581308 | -0.644 |
| 0.5486917960180737 | 0.836 |
| -0.07911704249342456 | -0.997 |
| -0.6736956436465571 | 0.739 |
| 0.9687143340637886 | 0.248 |
| 0.07911704249342437 | -0.997 |
| -0.9853128822394974 | -0.171 |
| -0.5038056506013299 | 0.864 |
| 0.45751530847532307 | 0.889 |
| -0.4338837391175584 | -0.901 |
| 0.15773807393743752 | 0.987 |
| 0.33650143872273913 | -0.942 |
| -0.9174397974871565 | 0.398 |
| 0.7818314824680298 | 0.623 |
| 0.48082802797435914 | -0.877 |
| -0.8287093708368186 | -0.56 |
| -0.8136468209091604 | 0.581 |
| 0.05277534713046237 | 0.999 |
| -0.026396871769835826 | -1 |
| -0.26094344889801746 | 0.965 |
| 0.6929684125462466 | -0.721 |
| -0.9999128816724107 | -0.013 |
| 0.45751530847532307 | 0.889 |
| 0.7980172272802396 | -0.603 |
| -0.5264321628773555 | -0.85 |
| -0.9804620471832867 | 0.197 |
| -0.36124166618715303 | 0.932 |
| 0.38573013845977966 | -0.923 |
| -0.6337553362123161 | 0.774 |
| 0.9276227536119478 | -0.374 |
| -0.9066174626478123 | -0.422 |
| 0.05277534713046237 | 0.999 |
| 0.9749279121818236 | -0.223 |
| -0.13161669982939317 | -0.991 |
| -0.9749279121818236 | -0.223 |
| -0.711758240489971 | 0.702 |
| 0.7300520325410703 | -0.683 |
| -0.8951632913550626 | 0.446 |
| 0.9992160261242876 | 0.04 |
| -0.6539533652969677 | -0.757 |
| -0.36124166618715303 | 0.932 |
| 0.9804620471832867 | 0.197 |
| 0.2863348491221129 | -0.958 |
| -0.7980172272802395 | -0.603 |
| -0.9371592343544655 | 0.349 |
| 0.9460425935861947 | -0.324 |
| -0.9992160261242876 | 0.04 |
| 0.8951632913550623 | 0.446 |
| -0.28633484912211227 | -0.958 |
| -0.711758240489971 | 0.702 |
| 0.8136468209091602 | 0.581 |
| 0.6539533652969682 | -0.757 |
| -0.4808280279743593 | -0.877 |
| -0.9978228006780053 | -0.066 |
| 0.9957341762950345 | 0.092 |
| -0.9276227536119476 | -0.374 |
| 0.6337553362123162 | 0.774 |
| 0.13161669982939386 | -0.991 |
| -0.9371592343544655 | 0.349 |
| 0.5038056506013295 | 0.864 |
| 0.9066174626478126 | -0.422 |
| -0.07911704249342456 | -0.997 |
| -0.8830852662071508 | -0.469 |
| 0.8703918045762196 | 0.492 |
| -0.6929684125462469 | -0.721 |
| 0.26094344889801674 | 0.965 |
| 0.5264321628773561 | -0.85 |
| -0.9978228006780053 | -0.066 |
| 0.10540359990284776 | 0.994 |
| 0.9999128816724107 | -0.013 |
| 0.33650143872273913 | -0.942 |
| -0.6131156327275369 | -0.79 |
| 0.5920486389876383 | 0.806 |
| -0.33650143872273935 | -0.942 |
| -0.1577380739374372 | 0.987 |
| 0.8287093708368187 | -0.56 |
| -0.8830852662071508 | -0.469 |
| -0.3115266979333915 | 0.95 |
| 0.9174397974871562 | 0.398 |
| 0.6929684125462466 | -0.721 |
| -0.23537019294084238 | -0.972 |
| 0.20963290366854653 | 0.978 |
| 0.07911704249342437 | -0.997 |
| -0.5486917960180743 | 0.836 |
| 0.9853128822394974 | -0.171 |
| -0.6131156327275369 | -0.79 |
| -0.6736956436465571 | 0.739 |
| 0.6736956436465572 | 0.739 |
| 0.9276227536119478 | -0.374 |
| 0.18374951781657037 | -0.983 |
| -0.2096329036685463 | 0.978 |
| 0.48082802797435914 | -0.877 |
| -0.8431943797272183 | 0.538 |
| 0.9687143340637886 | 0.248 |
| -0.23537019294084238 | -0.972 |
| -0.9174397974871565 | 0.398 |
| 0.31152669793339155 | 0.95 |
| 0.9992160261242876 | 0.04 |
| 0.570569036923155 | -0.821 |
| -0.5920486389876387 | 0.806 |
| 0.7980172272802396 | -0.603 |
| -0.9894770367246195 | 0.145 |
| 0.7818314824680298 | 0.623 |
| 0.18374951781657037 | -0.983 |
| -0.9999128816724107 | -0.013 |
| -0.1054035999028482 | 0.994 |
| 0.8951632913550623 | 0.446 |
| 0.8570917527421046 | -0.515 |
| -0.8703918045762195 | 0.492 |
| 0.9749279121818236 | -0.223 |
| -0.961825643172819 | -0.274 |
| 0.45751530847532307 | 0.889 |
| 0.570569036923155 | -0.821 |
| -0.9066174626478123 | -0.422 |
| -0.5038056506013299 | 0.864 |
| 0.6337553362123162 | 0.774 |
| 0.9929516085716734 | -0.119 |
| -0.9957341762950346 | 0.092 |
| 0.9804620471832867 | 0.197 |
| -0.765100866581308 | -0.644 |
| 0.05277534713046237 | 0.999 |
| 0.8570917527421046 | -0.515 |
| -0.6539533652969677 | -0.757 |
| -0.8136468209091604 | 0.581 |
| 0.26094344889801674 | 0.965 |
| 0.954266640349623 | 0.299 |
| -0.9460425935861949 | -0.324 |
| 0.8136468209091602 | 0.581 |
| -0.4338837391175584 | -0.901 |
| -0.36124166618715303 | 0.932 |
| 0.9929516085716734 | -0.119 |
| -0.28633484912211227 | -0.958 |
| -0.9804620471832867 | 0.197 |
| -0.1577380739374372 | 0.987 |
| 0.7478370394583644 | 0.664 |
| -0.7300520325410699 | -0.683 |
| 0.5038056506013295 | 0.864 |
| -0.026396871769835826 | -1 |
| -0.711758240489971 | 0.702 |
| 0.954266640349623 | 0.299 |
| 0.13161669982939386 | -0.991 |
| -0.9749279121818236 | -0.223 |
| -0.5486917960180743 | 0.836 |
| 0.40994978912605357 | 0.912 |
| -0.3857301384597794 | -0.923 |
| 0.10540359990284776 | 0.994 |
| 0.38573013845977966 | -0.923 |
| -0.9371592343544655 | 0.349 |
| 0.7478370394583644 | 0.664 |
| 0.5264321628773561 | -0.85 |
| -0.7980172272802395 | -0.603 |
| -0.8431943797272183 | 0.538 |
| 0.0 | 1 |
| 0.026396871769836513 | -1 |
| -0.3115266979333915 | 0.95 |
| 0.7300520325410703 | -0.683 |
| -0.9978228006780053 | -0.066 |
| 0.40994978912605357 | 0.912 |
| 0.8287093708368187 | -0.56 |
| -0.4808280279743593 | -0.877 |
| -0.9894770367246195 | 0.145 |
| -0.40994978912605373 | 0.912 |